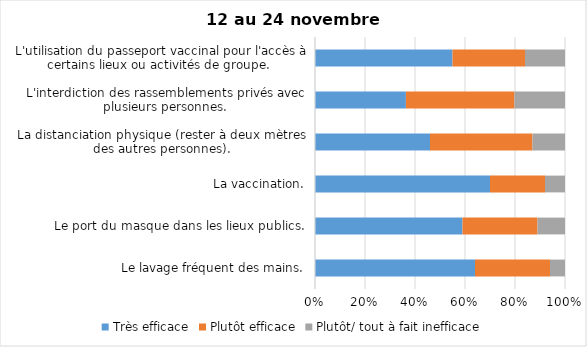
| Category | Très efficace | Plutôt efficace | Plutôt/ tout à fait inefficace |
|---|---|---|---|
| Le lavage fréquent des mains. | 64 | 30 | 6 |
| Le port du masque dans les lieux publics. | 59 | 30 | 11 |
| La vaccination. | 70 | 22 | 8 |
| La distanciation physique (rester à deux mètres des autres personnes). | 46 | 41 | 13 |
| L'interdiction des rassemblements privés avec plusieurs personnes. | 36 | 43 | 20 |
| L'utilisation du passeport vaccinal pour l'accès à certains lieux ou activités de groupe.  | 55 | 29 | 16 |